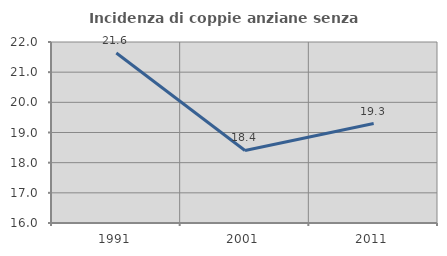
| Category | Incidenza di coppie anziane senza figli  |
|---|---|
| 1991.0 | 21.637 |
| 2001.0 | 18.405 |
| 2011.0 | 19.298 |